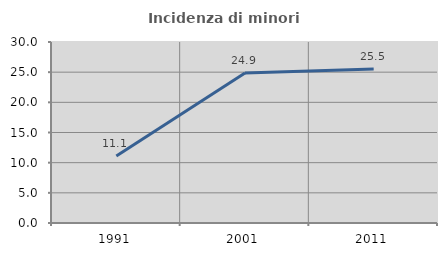
| Category | Incidenza di minori stranieri |
|---|---|
| 1991.0 | 11.111 |
| 2001.0 | 24.877 |
| 2011.0 | 25.543 |